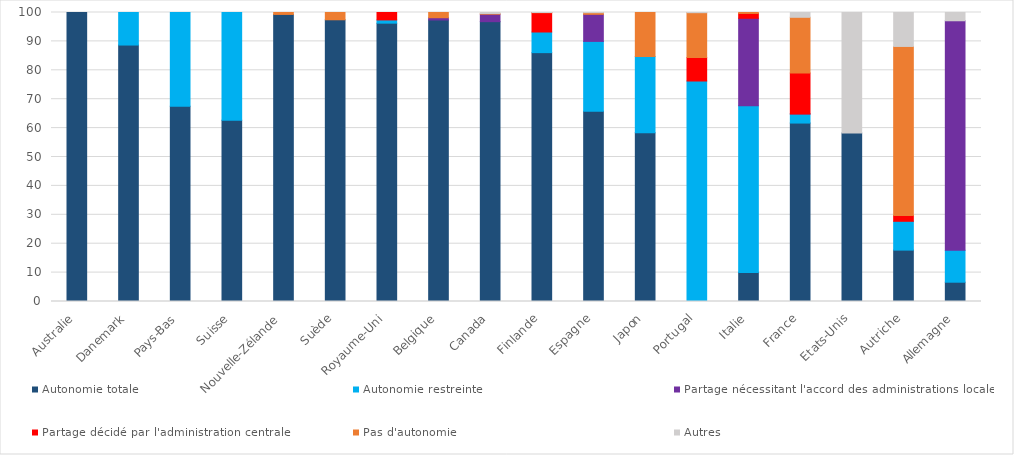
| Category | Autonomie totale | Autonomie restreinte | Partage nécessitant l'accord des administrations locales | Partage décidé par l'administration centrale | Pas d'autonomie | Autres |
|---|---|---|---|---|---|---|
| Australie | 100 | 0 | 0 | 0 | 0 | 0 |
| Danemark | 88.74 | 11.26 | 0 | 0 | 0 | 0 |
| Pays-Bas | 67.566 | 32.434 | 0 | 0 | 0 | 0 |
| Suisse | 62.741 | 37.259 | 0 | 0 | 0 | 0 |
| Nouvelle-Zélande | 99.333 | 0 | 0 | 0 | 0.667 | 0 |
| Suède | 97.481 | 0 | 0 | 0 | 2.519 | 0 |
| Royaume-Uni | 96.314 | 1.11 | 0 | 2.576 | 0 | 0 |
| Belgique | 97.404 | 0 | 0.79 | 0 | 1.806 | 0 |
| Canada | 96.833 | 0 | 2.579 | 0 | 0.227 | 0.361 |
| Finlande | 86.11 | 7.141 | 0 | 6.669 | 0.071 | 0.009 |
| Espagne | 65.829 | 24.166 | 9.368 | 0 | 0.572 | 0.064 |
| Japon | 58.43 | 26.366 | 0 | 0 | 15.204 | 0 |
| Portugal | 0 | 76.294 | 0 | 8.092 | 15.547 | 0.066 |
| Italie | 10.076 | 57.637 | 30.291 | 1.66 | 0.336 | 0 |
| France | 61.744 | 3.159 | 0.013 | 14.185 | 19.242 | 1.657 |
| Etats-Unis | 58.305 | 0 | 0 | 0 | 0 | 41.695 |
| Autriche | 17.782 | 9.971 | 0 | 1.976 | 58.525 | 11.745 |
| Allemagne | 6.678 | 11.034 | 79.428 | 0 | 0 | 2.86 |